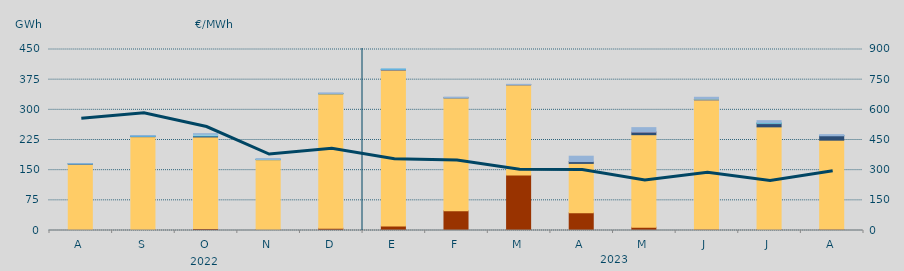
| Category | Carbón | Ciclo Combinado | Cogeneración | Consumo Bombeo | Enlace Península Baleares | Eólica | Hidráulica | Internacionales | Otras Renovables | Residuos no Renovables | Solar fotovoltaica | Solar térmica | Turbinación bombeo |
|---|---|---|---|---|---|---|---|---|---|---|---|---|---|
| A | 115 | 164760.775 | 0 | 1020.576 | 102 | 0 | 100 | 0 | 0 | 0 | 0 | 0 | 81.25 |
| S | 555 | 232710.6 | 0 | 982.5 | 388.7 | 0 | 418.25 | 0 | 0 | 0 | 0 | 0 | 708.4 |
| O | 4836.8 | 227776.455 | 0 | 2792.6 | 0 | 0 | 208.75 | 3824.8 | 0 | 0 | 0 | 0 | 1365.5 |
| N | 2212.7 | 174006.854 | 0 | 126 | 0 | 0 | 449.2 | 613.333 | 0 | 0 | 0 | 0 | 1312.25 |
| D | 5478 | 334554.358 | 0 | 258.25 | 0 | 0 | 227.925 | 0 | 0 | 0 | 0 | 0 | 1594.663 |
| E | 11268 | 387716.675 | 0 | 572.573 | 681.8 | 0 | 835.85 | 0 | 0 | 0 | 0 | 0 | 77.5 |
| F | 48958 | 280733.853 | 0 | 43.033 | 0 | 0 | 0 | 0 | 0 | 0 | 0 | 0 | 1846.75 |
| M | 138130.4 | 224071.017 | 0 | 316.875 | 152.4 | 0 | 0 | 0 | 0 | 0 | 0 | 0 | 717.667 |
| A | 43920 | 122955.6 | 0 | 4435.017 | 148.1 | 0 | 0 | 0 | 0 | 0 | 0 | 0 | 13251.877 |
| M | 8172.8 | 230037.608 | 0 | 6374.2 | 1318.3 | 0 | 0 | 0 | 0 | 0 | 0 | 0 | 9849.292 |
| J | 3400 | 321495.908 | 0 | 191.083 | 1224 | 175.975 | 0 | 0 | 0 | 0 | 0 | 0 | 4721.775 |
| J | 2260 | 255417.442 | 0 | 8045.584 | 1144 | 41.666 | 475 | 647.8 | 0 | 0 | 0 | 0 | 5129.95 |
| A | 2834 | 221716.226 | 0 | 11049.55 | 362 | 0 | 144.325 | 0 | 0 | 0 | 0 | 0 | 2296.991 |